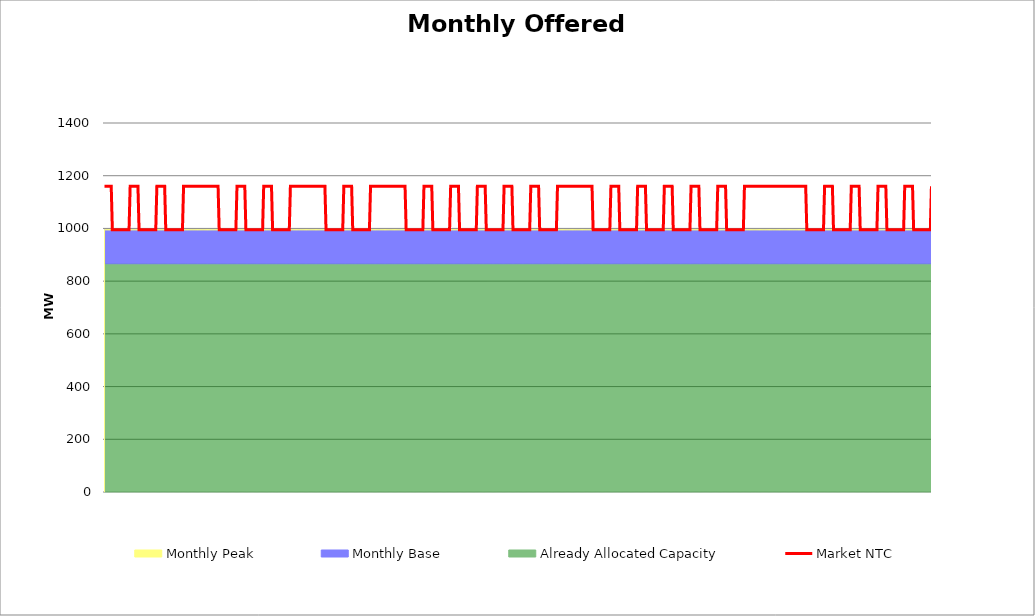
| Category | Market NTC |
|---|---|
| 0 | 1160 |
| 1 | 1160 |
| 2 | 1160 |
| 3 | 1160 |
| 4 | 1160 |
| 5 | 1160 |
| 6 | 1160 |
| 7 | 995 |
| 8 | 995 |
| 9 | 995 |
| 10 | 995 |
| 11 | 995 |
| 12 | 995 |
| 13 | 995 |
| 14 | 995 |
| 15 | 995 |
| 16 | 995 |
| 17 | 995 |
| 18 | 995 |
| 19 | 995 |
| 20 | 995 |
| 21 | 995 |
| 22 | 995 |
| 23 | 1160 |
| 24 | 1160 |
| 25 | 1160 |
| 26 | 1160 |
| 27 | 1160 |
| 28 | 1160 |
| 29 | 1160 |
| 30 | 1160 |
| 31 | 995 |
| 32 | 995 |
| 33 | 995 |
| 34 | 995 |
| 35 | 995 |
| 36 | 995 |
| 37 | 995 |
| 38 | 995 |
| 39 | 995 |
| 40 | 995 |
| 41 | 995 |
| 42 | 995 |
| 43 | 995 |
| 44 | 995 |
| 45 | 995 |
| 46 | 995 |
| 47 | 1160 |
| 48 | 1160 |
| 49 | 1160 |
| 50 | 1160 |
| 51 | 1160 |
| 52 | 1160 |
| 53 | 1160 |
| 54 | 1160 |
| 55 | 995 |
| 56 | 995 |
| 57 | 995 |
| 58 | 995 |
| 59 | 995 |
| 60 | 995 |
| 61 | 995 |
| 62 | 995 |
| 63 | 995 |
| 64 | 995 |
| 65 | 995 |
| 66 | 995 |
| 67 | 995 |
| 68 | 995 |
| 69 | 995 |
| 70 | 995 |
| 71 | 1160 |
| 72 | 1160 |
| 73 | 1160 |
| 74 | 1160 |
| 75 | 1160 |
| 76 | 1160 |
| 77 | 1160 |
| 78 | 1160 |
| 79 | 1160 |
| 80 | 1160 |
| 81 | 1160 |
| 82 | 1160 |
| 83 | 1160 |
| 84 | 1160 |
| 85 | 1160 |
| 86 | 1160 |
| 87 | 1160 |
| 88 | 1160 |
| 89 | 1160 |
| 90 | 1160 |
| 91 | 1160 |
| 92 | 1160 |
| 93 | 1160 |
| 94 | 1160 |
| 95 | 1160 |
| 96 | 1160 |
| 97 | 1160 |
| 98 | 1160 |
| 99 | 1160 |
| 100 | 1160 |
| 101 | 1160 |
| 102 | 1160 |
| 103 | 995 |
| 104 | 995 |
| 105 | 995 |
| 106 | 995 |
| 107 | 995 |
| 108 | 995 |
| 109 | 995 |
| 110 | 995 |
| 111 | 995 |
| 112 | 995 |
| 113 | 995 |
| 114 | 995 |
| 115 | 995 |
| 116 | 995 |
| 117 | 995 |
| 118 | 995 |
| 119 | 1160 |
| 120 | 1160 |
| 121 | 1160 |
| 122 | 1160 |
| 123 | 1160 |
| 124 | 1160 |
| 125 | 1160 |
| 126 | 1160 |
| 127 | 995 |
| 128 | 995 |
| 129 | 995 |
| 130 | 995 |
| 131 | 995 |
| 132 | 995 |
| 133 | 995 |
| 134 | 995 |
| 135 | 995 |
| 136 | 995 |
| 137 | 995 |
| 138 | 995 |
| 139 | 995 |
| 140 | 995 |
| 141 | 995 |
| 142 | 995 |
| 143 | 1160 |
| 144 | 1160 |
| 145 | 1160 |
| 146 | 1160 |
| 147 | 1160 |
| 148 | 1160 |
| 149 | 1160 |
| 150 | 1160 |
| 151 | 995 |
| 152 | 995 |
| 153 | 995 |
| 154 | 995 |
| 155 | 995 |
| 156 | 995 |
| 157 | 995 |
| 158 | 995 |
| 159 | 995 |
| 160 | 995 |
| 161 | 995 |
| 162 | 995 |
| 163 | 995 |
| 164 | 995 |
| 165 | 995 |
| 166 | 995 |
| 167 | 1160 |
| 168 | 1160 |
| 169 | 1160 |
| 170 | 1160 |
| 171 | 1160 |
| 172 | 1160 |
| 173 | 1160 |
| 174 | 1160 |
| 175 | 1160 |
| 176 | 1160 |
| 177 | 1160 |
| 178 | 1160 |
| 179 | 1160 |
| 180 | 1160 |
| 181 | 1160 |
| 182 | 1160 |
| 183 | 1160 |
| 184 | 1160 |
| 185 | 1160 |
| 186 | 1160 |
| 187 | 1160 |
| 188 | 1160 |
| 189 | 1160 |
| 190 | 1160 |
| 191 | 1160 |
| 192 | 1160 |
| 193 | 1160 |
| 194 | 1160 |
| 195 | 1160 |
| 196 | 1160 |
| 197 | 1160 |
| 198 | 1160 |
| 199 | 995 |
| 200 | 995 |
| 201 | 995 |
| 202 | 995 |
| 203 | 995 |
| 204 | 995 |
| 205 | 995 |
| 206 | 995 |
| 207 | 995 |
| 208 | 995 |
| 209 | 995 |
| 210 | 995 |
| 211 | 995 |
| 212 | 995 |
| 213 | 995 |
| 214 | 995 |
| 215 | 1160 |
| 216 | 1160 |
| 217 | 1160 |
| 218 | 1160 |
| 219 | 1160 |
| 220 | 1160 |
| 221 | 1160 |
| 222 | 1160 |
| 223 | 995 |
| 224 | 995 |
| 225 | 995 |
| 226 | 995 |
| 227 | 995 |
| 228 | 995 |
| 229 | 995 |
| 230 | 995 |
| 231 | 995 |
| 232 | 995 |
| 233 | 995 |
| 234 | 995 |
| 235 | 995 |
| 236 | 995 |
| 237 | 995 |
| 238 | 995 |
| 239 | 1160 |
| 240 | 1160 |
| 241 | 1160 |
| 242 | 1160 |
| 243 | 1160 |
| 244 | 1160 |
| 245 | 1160 |
| 246 | 1160 |
| 247 | 1160 |
| 248 | 1160 |
| 249 | 1160 |
| 250 | 1160 |
| 251 | 1160 |
| 252 | 1160 |
| 253 | 1160 |
| 254 | 1160 |
| 255 | 1160 |
| 256 | 1160 |
| 257 | 1160 |
| 258 | 1160 |
| 259 | 1160 |
| 260 | 1160 |
| 261 | 1160 |
| 262 | 1160 |
| 263 | 1160 |
| 264 | 1160 |
| 265 | 1160 |
| 266 | 1160 |
| 267 | 1160 |
| 268 | 1160 |
| 269 | 1160 |
| 270 | 1160 |
| 271 | 995 |
| 272 | 995 |
| 273 | 995 |
| 274 | 995 |
| 275 | 995 |
| 276 | 995 |
| 277 | 995 |
| 278 | 995 |
| 279 | 995 |
| 280 | 995 |
| 281 | 995 |
| 282 | 995 |
| 283 | 995 |
| 284 | 995 |
| 285 | 995 |
| 286 | 995 |
| 287 | 1160 |
| 288 | 1160 |
| 289 | 1160 |
| 290 | 1160 |
| 291 | 1160 |
| 292 | 1160 |
| 293 | 1160 |
| 294 | 1160 |
| 295 | 995 |
| 296 | 995 |
| 297 | 995 |
| 298 | 995 |
| 299 | 995 |
| 300 | 995 |
| 301 | 995 |
| 302 | 995 |
| 303 | 995 |
| 304 | 995 |
| 305 | 995 |
| 306 | 995 |
| 307 | 995 |
| 308 | 995 |
| 309 | 995 |
| 310 | 995 |
| 311 | 1160 |
| 312 | 1160 |
| 313 | 1160 |
| 314 | 1160 |
| 315 | 1160 |
| 316 | 1160 |
| 317 | 1160 |
| 318 | 1160 |
| 319 | 995 |
| 320 | 995 |
| 321 | 995 |
| 322 | 995 |
| 323 | 995 |
| 324 | 995 |
| 325 | 995 |
| 326 | 995 |
| 327 | 995 |
| 328 | 995 |
| 329 | 995 |
| 330 | 995 |
| 331 | 995 |
| 332 | 995 |
| 333 | 995 |
| 334 | 995 |
| 335 | 1160 |
| 336 | 1160 |
| 337 | 1160 |
| 338 | 1160 |
| 339 | 1160 |
| 340 | 1160 |
| 341 | 1160 |
| 342 | 1160 |
| 343 | 995 |
| 344 | 995 |
| 345 | 995 |
| 346 | 995 |
| 347 | 995 |
| 348 | 995 |
| 349 | 995 |
| 350 | 995 |
| 351 | 995 |
| 352 | 995 |
| 353 | 995 |
| 354 | 995 |
| 355 | 995 |
| 356 | 995 |
| 357 | 995 |
| 358 | 995 |
| 359 | 1160 |
| 360 | 1160 |
| 361 | 1160 |
| 362 | 1160 |
| 363 | 1160 |
| 364 | 1160 |
| 365 | 1160 |
| 366 | 1160 |
| 367 | 995 |
| 368 | 995 |
| 369 | 995 |
| 370 | 995 |
| 371 | 995 |
| 372 | 995 |
| 373 | 995 |
| 374 | 995 |
| 375 | 995 |
| 376 | 995 |
| 377 | 995 |
| 378 | 995 |
| 379 | 995 |
| 380 | 995 |
| 381 | 995 |
| 382 | 995 |
| 383 | 1160 |
| 384 | 1160 |
| 385 | 1160 |
| 386 | 1160 |
| 387 | 1160 |
| 388 | 1160 |
| 389 | 1160 |
| 390 | 1160 |
| 391 | 995 |
| 392 | 995 |
| 393 | 995 |
| 394 | 995 |
| 395 | 995 |
| 396 | 995 |
| 397 | 995 |
| 398 | 995 |
| 399 | 995 |
| 400 | 995 |
| 401 | 995 |
| 402 | 995 |
| 403 | 995 |
| 404 | 995 |
| 405 | 995 |
| 406 | 995 |
| 407 | 1160 |
| 408 | 1160 |
| 409 | 1160 |
| 410 | 1160 |
| 411 | 1160 |
| 412 | 1160 |
| 413 | 1160 |
| 414 | 1160 |
| 415 | 1160 |
| 416 | 1160 |
| 417 | 1160 |
| 418 | 1160 |
| 419 | 1160 |
| 420 | 1160 |
| 421 | 1160 |
| 422 | 1160 |
| 423 | 1160 |
| 424 | 1160 |
| 425 | 1160 |
| 426 | 1160 |
| 427 | 1160 |
| 428 | 1160 |
| 429 | 1160 |
| 430 | 1160 |
| 431 | 1160 |
| 432 | 1160 |
| 433 | 1160 |
| 434 | 1160 |
| 435 | 1160 |
| 436 | 1160 |
| 437 | 1160 |
| 438 | 1160 |
| 439 | 995 |
| 440 | 995 |
| 441 | 995 |
| 442 | 995 |
| 443 | 995 |
| 444 | 995 |
| 445 | 995 |
| 446 | 995 |
| 447 | 995 |
| 448 | 995 |
| 449 | 995 |
| 450 | 995 |
| 451 | 995 |
| 452 | 995 |
| 453 | 995 |
| 454 | 995 |
| 455 | 1160 |
| 456 | 1160 |
| 457 | 1160 |
| 458 | 1160 |
| 459 | 1160 |
| 460 | 1160 |
| 461 | 1160 |
| 462 | 1160 |
| 463 | 995 |
| 464 | 995 |
| 465 | 995 |
| 466 | 995 |
| 467 | 995 |
| 468 | 995 |
| 469 | 995 |
| 470 | 995 |
| 471 | 995 |
| 472 | 995 |
| 473 | 995 |
| 474 | 995 |
| 475 | 995 |
| 476 | 995 |
| 477 | 995 |
| 478 | 995 |
| 479 | 1160 |
| 480 | 1160 |
| 481 | 1160 |
| 482 | 1160 |
| 483 | 1160 |
| 484 | 1160 |
| 485 | 1160 |
| 486 | 1160 |
| 487 | 995 |
| 488 | 995 |
| 489 | 995 |
| 490 | 995 |
| 491 | 995 |
| 492 | 995 |
| 493 | 995 |
| 494 | 995 |
| 495 | 995 |
| 496 | 995 |
| 497 | 995 |
| 498 | 995 |
| 499 | 995 |
| 500 | 995 |
| 501 | 995 |
| 502 | 995 |
| 503 | 1160 |
| 504 | 1160 |
| 505 | 1160 |
| 506 | 1160 |
| 507 | 1160 |
| 508 | 1160 |
| 509 | 1160 |
| 510 | 1160 |
| 511 | 995 |
| 512 | 995 |
| 513 | 995 |
| 514 | 995 |
| 515 | 995 |
| 516 | 995 |
| 517 | 995 |
| 518 | 995 |
| 519 | 995 |
| 520 | 995 |
| 521 | 995 |
| 522 | 995 |
| 523 | 995 |
| 524 | 995 |
| 525 | 995 |
| 526 | 995 |
| 527 | 1160 |
| 528 | 1160 |
| 529 | 1160 |
| 530 | 1160 |
| 531 | 1160 |
| 532 | 1160 |
| 533 | 1160 |
| 534 | 1160 |
| 535 | 995 |
| 536 | 995 |
| 537 | 995 |
| 538 | 995 |
| 539 | 995 |
| 540 | 995 |
| 541 | 995 |
| 542 | 995 |
| 543 | 995 |
| 544 | 995 |
| 545 | 995 |
| 546 | 995 |
| 547 | 995 |
| 548 | 995 |
| 549 | 995 |
| 550 | 995 |
| 551 | 1160 |
| 552 | 1160 |
| 553 | 1160 |
| 554 | 1160 |
| 555 | 1160 |
| 556 | 1160 |
| 557 | 1160 |
| 558 | 1160 |
| 559 | 995 |
| 560 | 995 |
| 561 | 995 |
| 562 | 995 |
| 563 | 995 |
| 564 | 995 |
| 565 | 995 |
| 566 | 995 |
| 567 | 995 |
| 568 | 995 |
| 569 | 995 |
| 570 | 995 |
| 571 | 995 |
| 572 | 995 |
| 573 | 995 |
| 574 | 995 |
| 575 | 1160 |
| 576 | 1160 |
| 577 | 1160 |
| 578 | 1160 |
| 579 | 1160 |
| 580 | 1160 |
| 581 | 1160 |
| 582 | 1160 |
| 583 | 1160 |
| 584 | 1160 |
| 585 | 1160 |
| 586 | 1160 |
| 587 | 1160 |
| 588 | 1160 |
| 589 | 1160 |
| 590 | 1160 |
| 591 | 1160 |
| 592 | 1160 |
| 593 | 1160 |
| 594 | 1160 |
| 595 | 1160 |
| 596 | 1160 |
| 597 | 1160 |
| 598 | 1160 |
| 599 | 1160 |
| 600 | 1160 |
| 601 | 1160 |
| 602 | 1160 |
| 603 | 1160 |
| 604 | 1160 |
| 605 | 1160 |
| 606 | 1160 |
| 607 | 1160 |
| 608 | 1160 |
| 609 | 1160 |
| 610 | 1160 |
| 611 | 1160 |
| 612 | 1160 |
| 613 | 1160 |
| 614 | 1160 |
| 615 | 1160 |
| 616 | 1160 |
| 617 | 1160 |
| 618 | 1160 |
| 619 | 1160 |
| 620 | 1160 |
| 621 | 1160 |
| 622 | 1160 |
| 623 | 1160 |
| 624 | 1160 |
| 625 | 1160 |
| 626 | 1160 |
| 627 | 1160 |
| 628 | 1160 |
| 629 | 1160 |
| 630 | 1160 |
| 631 | 995 |
| 632 | 995 |
| 633 | 995 |
| 634 | 995 |
| 635 | 995 |
| 636 | 995 |
| 637 | 995 |
| 638 | 995 |
| 639 | 995 |
| 640 | 995 |
| 641 | 995 |
| 642 | 995 |
| 643 | 995 |
| 644 | 995 |
| 645 | 995 |
| 646 | 995 |
| 647 | 1160 |
| 648 | 1160 |
| 649 | 1160 |
| 650 | 1160 |
| 651 | 1160 |
| 652 | 1160 |
| 653 | 1160 |
| 654 | 1160 |
| 655 | 995 |
| 656 | 995 |
| 657 | 995 |
| 658 | 995 |
| 659 | 995 |
| 660 | 995 |
| 661 | 995 |
| 662 | 995 |
| 663 | 995 |
| 664 | 995 |
| 665 | 995 |
| 666 | 995 |
| 667 | 995 |
| 668 | 995 |
| 669 | 995 |
| 670 | 995 |
| 671 | 1160 |
| 672 | 1160 |
| 673 | 1160 |
| 674 | 1160 |
| 675 | 1160 |
| 676 | 1160 |
| 677 | 1160 |
| 678 | 1160 |
| 679 | 995 |
| 680 | 995 |
| 681 | 995 |
| 682 | 995 |
| 683 | 995 |
| 684 | 995 |
| 685 | 995 |
| 686 | 995 |
| 687 | 995 |
| 688 | 995 |
| 689 | 995 |
| 690 | 995 |
| 691 | 995 |
| 692 | 995 |
| 693 | 995 |
| 694 | 995 |
| 695 | 1160 |
| 696 | 1160 |
| 697 | 1160 |
| 698 | 1160 |
| 699 | 1160 |
| 700 | 1160 |
| 701 | 1160 |
| 702 | 1160 |
| 703 | 995 |
| 704 | 995 |
| 705 | 995 |
| 706 | 995 |
| 707 | 995 |
| 708 | 995 |
| 709 | 995 |
| 710 | 995 |
| 711 | 995 |
| 712 | 995 |
| 713 | 995 |
| 714 | 995 |
| 715 | 995 |
| 716 | 995 |
| 717 | 995 |
| 718 | 995 |
| 719 | 1160 |
| 720 | 1160 |
| 721 | 1160 |
| 722 | 1160 |
| 723 | 1160 |
| 724 | 1160 |
| 725 | 1160 |
| 726 | 1160 |
| 727 | 995 |
| 728 | 995 |
| 729 | 995 |
| 730 | 995 |
| 731 | 995 |
| 732 | 995 |
| 733 | 995 |
| 734 | 995 |
| 735 | 995 |
| 736 | 995 |
| 737 | 995 |
| 738 | 995 |
| 739 | 995 |
| 740 | 995 |
| 741 | 995 |
| 742 | 995 |
| 743 | 1160 |